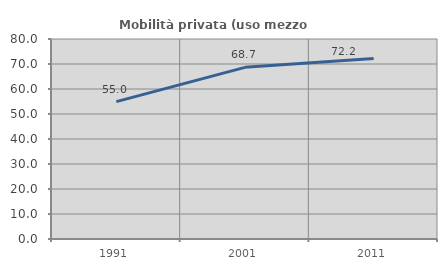
| Category | Mobilità privata (uso mezzo privato) |
|---|---|
| 1991.0 | 54.968 |
| 2001.0 | 68.666 |
| 2011.0 | 72.152 |